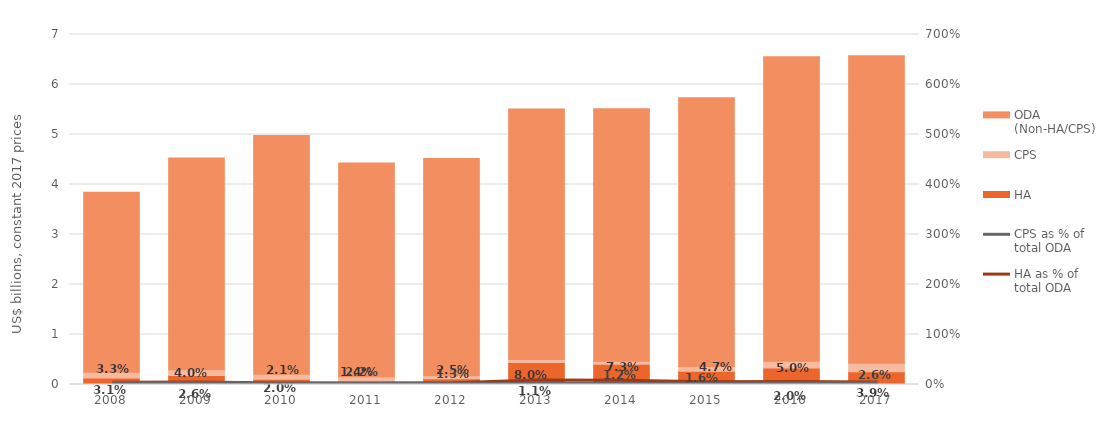
| Category | HA | CPS | ODA (Non-HA/CPS) |
|---|---|---|---|
| 2008.0 | 0.128 | 0.118 | 3.598 |
| 2009.0 | 0.18 | 0.117 | 4.233 |
| 2010.0 | 0.104 | 0.101 | 4.776 |
| 2011.0 | 0.06 | 0.096 | 4.273 |
| 2012.0 | 0.115 | 0.058 | 4.346 |
| 2013.0 | 0.44 | 0.059 | 5.01 |
| 2014.0 | 0.403 | 0.064 | 5.051 |
| 2015.0 | 0.267 | 0.092 | 5.375 |
| 2016.0 | 0.33 | 0.133 | 6.092 |
| 2017.0 | 0.256 | 0.171 | 6.149 |